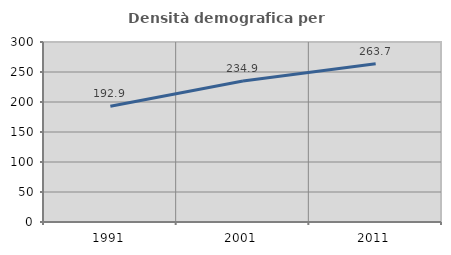
| Category | Densità demografica |
|---|---|
| 1991.0 | 192.927 |
| 2001.0 | 234.935 |
| 2011.0 | 263.66 |